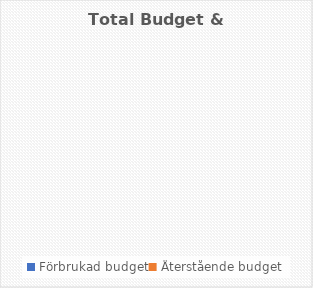
| Category | Total Budget & Costs |
|---|---|
| Förbrukad budget | 0 |
| Återstående budget | 0 |